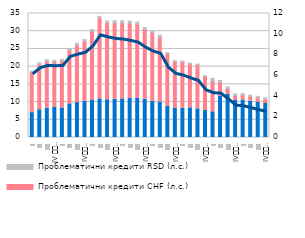
| Category | Проблематични кредити EUR (л.с.) | Проблематични кредити CHF (л.с.) | Проблематични кредити RSD (л.с.) |
|---|---|---|---|
| I | 7.031 | 11.315 | 0.376 |
| II | 7.838 | 12.854 | 0.398 |
| III | 8.287 | 13.256 | 0.398 |
| IV 
2013. | 8.472 | 12.907 | 0.424 |
| I | 8.364 | 13.289 | 0.434 |
| II | 9.502 | 15.183 | 0.445 |
| III | 9.861 | 16.293 | 0.431 |
| IV
2014. | 10.2 | 16.966 | 0.464 |
| I | 10.588 | 19.402 | 0.479 |
| II | 10.907 | 22.828 | 0.467 |
| III | 10.661 | 21.759 | 0.479 |
| IV
2015. | 10.774 | 21.561 | 0.595 |
| I | 10.906 | 21.449 | 0.603 |
| II | 11.118 | 21.151 | 0.6 |
| III | 11.109 | 20.882 | 0.585 |
| IV
2016. | 10.82 | 19.717 | 0.539 |
| I | 10.204 | 19.386 | 0.539 |
| II | 10.002 | 18.325 | 0.564 |
| III | 8.771 | 14.875 | 0.29 |
| IV
2017. | 8.337 | 13.073 | 0.274 |
| I | 8.247 | 13.09 | 0.266 |
| II | 8.373 | 12.384 | 0.241 |
| III | 8.081 | 12.357 | 0.265 |
| IV
2018. | 7.649 | 9.577 | 0.27 |
| I | 7.26 | 8.704 | 0.728 |
| II | 11.747 | 3.816 | 0.533 |
| III | 12.162 | 1.673 | 0.43 |
| IV
2019. | 10.454 | 1.442 | 0.401 |
| I | 10.571 | 1.411 | 0.399 |
| II | 10.24 | 1.341 | 0.391 |
| III | 9.985 | 1.262 | 0.38 |
| IV
2020. | 9.601 | 1.174 | 0.387 |